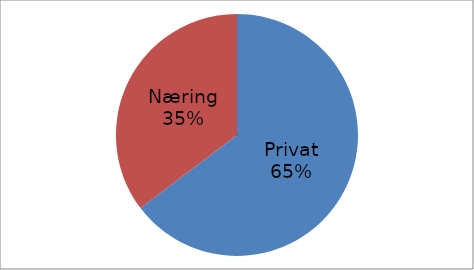
| Category | Series 0 |
|---|---|
| Privat | 37760378 |
| Næring | 20612386 |